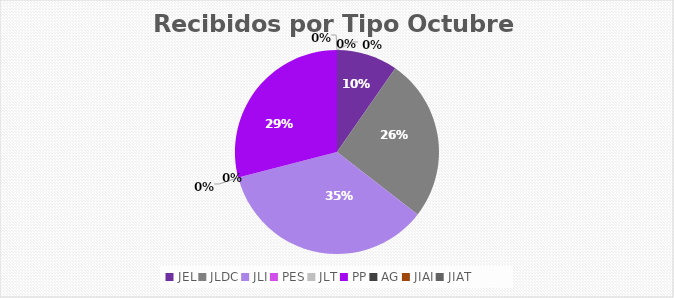
| Category | Series 0 |
|---|---|
| JEL | 3 |
| JLDC | 8 |
| JLI | 11 |
| PES | 0 |
| JLT | 0 |
| PP | 9 |
| AG | 0 |
| JIAI | 0 |
| JIAT | 0 |